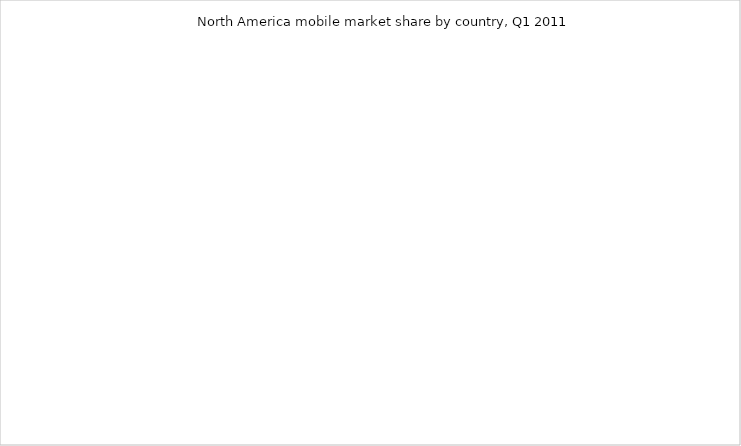
| Category | Series 0 |
|---|---|
| Canada | 0 |
| USA | 0 |